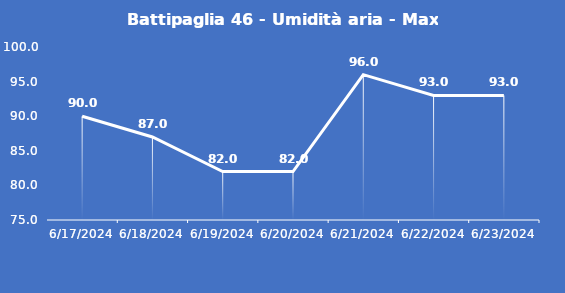
| Category | Battipaglia 46 - Umidità aria - Max (%) |
|---|---|
| 6/17/24 | 90 |
| 6/18/24 | 87 |
| 6/19/24 | 82 |
| 6/20/24 | 82 |
| 6/21/24 | 96 |
| 6/22/24 | 93 |
| 6/23/24 | 93 |